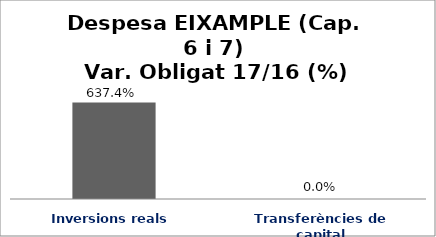
| Category | Series 0 |
|---|---|
| Inversions reals | 6.374 |
| Transferències de capital | 0 |